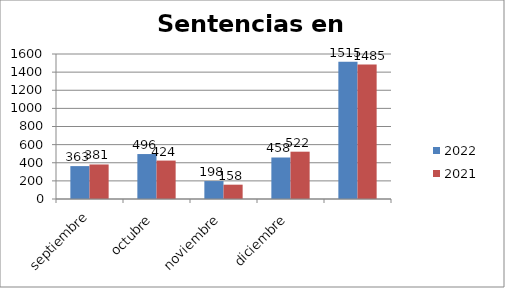
| Category | 2022 | 2021 |
|---|---|---|
| septiembre | 363 | 381 |
| octubre | 496 | 424 |
| noviembre | 198 | 158 |
| diciembre | 458 | 522 |